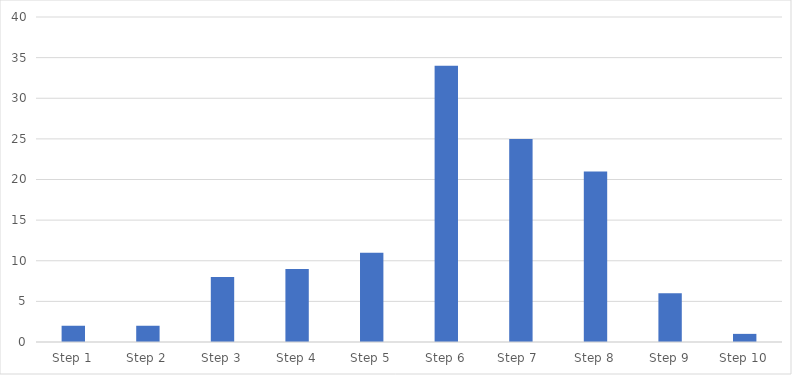
| Category | Number of Responses |
|---|---|
| Step 1 | 2 |
| Step 2 | 2 |
| Step 3 | 8 |
| Step 4 | 9 |
| Step 5 | 11 |
| Step 6 | 34 |
| Step 7  | 25 |
| Step 8 | 21 |
| Step 9 | 6 |
| Step 10 | 1 |